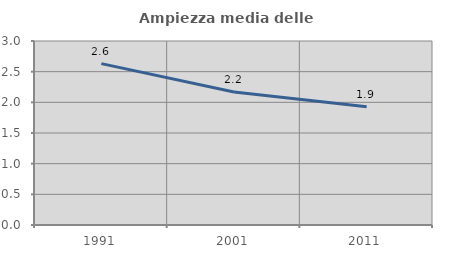
| Category | Ampiezza media delle famiglie |
|---|---|
| 1991.0 | 2.631 |
| 2001.0 | 2.168 |
| 2011.0 | 1.93 |